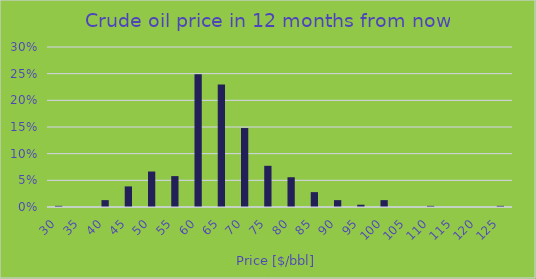
| Category | Series 0 |
|---|---|
| 30.0 | 0.002 |
| 35.0 | 0 |
| 40.0 | 0.013 |
| 45.0 | 0.039 |
| 50.0 | 0.067 |
| 55.0 | 0.058 |
| 60.0 | 0.249 |
| 65.0 | 0.23 |
| 70.0 | 0.148 |
| 75.0 | 0.077 |
| 80.0 | 0.056 |
| 85.0 | 0.028 |
| 90.0 | 0.013 |
| 95.0 | 0.004 |
| 100.0 | 0.013 |
| 105.0 | 0 |
| 110.0 | 0.002 |
| 115.0 | 0 |
| 120.0 | 0 |
| 125.0 | 0.002 |